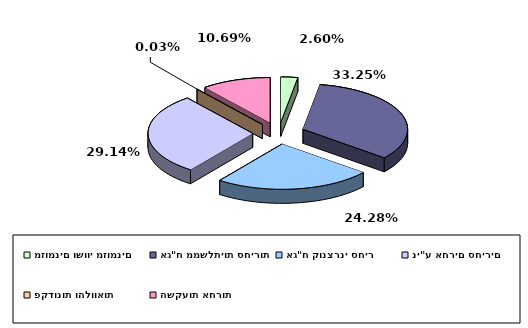
| Category | Series 0 |
|---|---|
| מזומנים ושווי מזומנים | 0.026 |
| אג"ח ממשלתיות סחירות | 0.332 |
| אג"ח קונצרני סחיר | 0.243 |
| ני"ע אחרים סחירים | 0.291 |
| פקדונות והלוואות | 0 |
| השקעות אחרות | 0.107 |